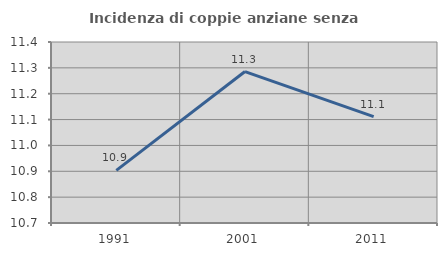
| Category | Incidenza di coppie anziane senza figli  |
|---|---|
| 1991.0 | 10.903 |
| 2001.0 | 11.286 |
| 2011.0 | 11.111 |